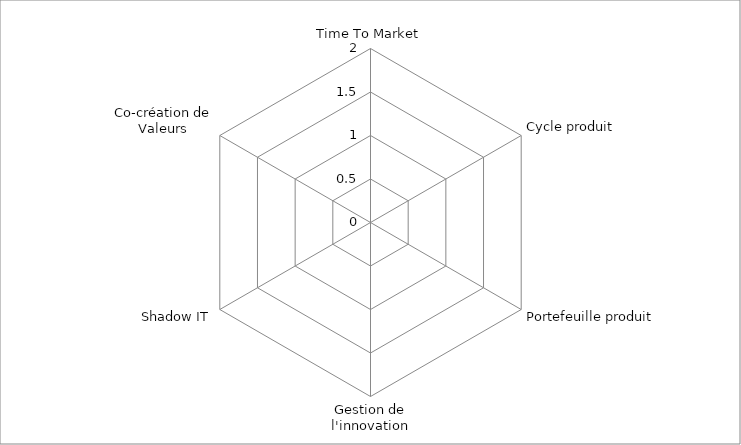
| Category | Series 0 |
|---|---|
| Time To Market | 0 |
| Cycle produit | 0 |
| Portefeuille produit | 0 |
| Gestion de l'innovation | 0 |
| Shadow IT | 0 |
| Co-création de Valeurs | 0 |